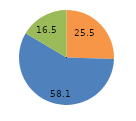
| Category | Series 0 |
|---|---|
| 0 | 25.5 |
| 1 | 58.1 |
| 2 | 16.5 |